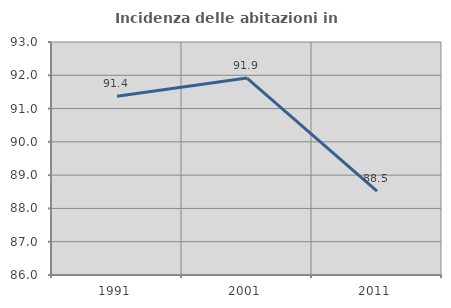
| Category | Incidenza delle abitazioni in proprietà  |
|---|---|
| 1991.0 | 91.369 |
| 2001.0 | 91.916 |
| 2011.0 | 88.52 |